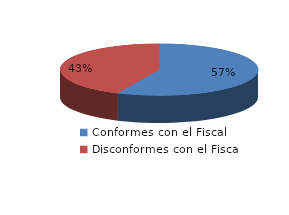
| Category | Series 0 |
|---|---|
| 0 | 513 |
| 1 | 390 |